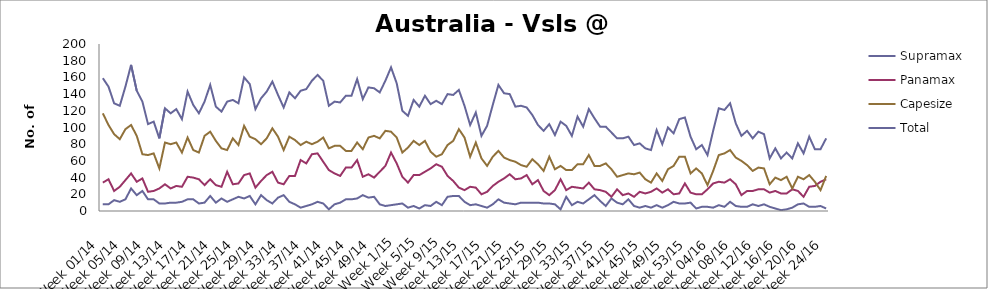
| Category | Supramax | Panamax | Capesize | Total |
|---|---|---|---|---|
| Week 01/14 | 8 | 34 | 117 | 159 |
| Week 02/14 | 8 | 38 | 103 | 149 |
| Week 03/14 | 13 | 24 | 92 | 129 |
| Week 04/14 | 11 | 29 | 86 | 126 |
| Week 05/14 | 14 | 37 | 98 | 149 |
| Week 06/14 | 27 | 45 | 103 | 175 |
| Week 07/14 | 19 | 35 | 90 | 144 |
| Week 08/14 | 24 | 39 | 68 | 131 |
| Week 09/14 | 14 | 23 | 67 | 104 |
| Week 10/14 | 14 | 24 | 69 | 107 |
| Week 11/14 | 9 | 27 | 51 | 87 |
| Week 12/14 | 9 | 32 | 82 | 123 |
| Week 13/14 | 10 | 27 | 80 | 117 |
| Week 14/14 | 10 | 30 | 82 | 122 |
| Week 15/14 | 11 | 29 | 70 | 110 |
| Week 16/14 | 14 | 41 | 88 | 143 |
| Week 17/14 | 14 | 40 | 73 | 127 |
| Week 18/14 | 9 | 38 | 70 | 117 |
| Week 19/14 | 10 | 31 | 90 | 131 |
| Week 20/14 | 18 | 38 | 95 | 151 |
| Week 21/14 | 10 | 31 | 84 | 125 |
| Week 22/14 | 15 | 29 | 75 | 119 |
| Week 23/14 | 11 | 47 | 73 | 131 |
| Week 24/14 | 14 | 32 | 87 | 133 |
| Week 25/14 | 17 | 33 | 79 | 129 |
| Week 26/14 | 15 | 43 | 102 | 160 |
| Week 27/14 | 18 | 45 | 89 | 152 |
| Week 28/14 | 8 | 28 | 86 | 122 |
| Week 29/14 | 19 | 36 | 80 | 135 |
| Week 30/14 | 13 | 43 | 87 | 143 |
| Week 31/14 | 9 | 47 | 99 | 155 |
| Week 32/14 | 16 | 34 | 89 | 139 |
| Week 33/14 | 19 | 32 | 73 | 124 |
| Week 34/14 | 11 | 42 | 89 | 142 |
| Week 35/14 | 8 | 42 | 85 | 135 |
| Week 36/14 | 4 | 61 | 79 | 144 |
| Week 37/14 | 6 | 57 | 83 | 146 |
| Week 38/14 | 8 | 68 | 80 | 156 |
| Week 39/14 | 11 | 69 | 83 | 163 |
| Week 40/14 | 9 | 59 | 88 | 156 |
| Week 41/14 | 2 | 49 | 75 | 126 |
| Week 42/14 | 8 | 45 | 78 | 131 |
| Week 43/14 | 10 | 42 | 78 | 130 |
| Week 44/14 | 14 | 52 | 72 | 138 |
| Week 45/14 | 14 | 52 | 72 | 138 |
| Week 46/14 | 15 | 61 | 82 | 158 |
| Week 47/14 | 19 | 41 | 74 | 134 |
| Week 48/14 | 16 | 44 | 88 | 148 |
| Week 49/14 | 17 | 40 | 90 | 147 |
| Week 50/14 | 8 | 47 | 87 | 142 |
| Week 51/14 | 6 | 54 | 96 | 156 |
| Week 52/14 | 7 | 70 | 95 | 172 |
| Week 1/15 | 8 | 57 | 88 | 153 |
| Week 2/15 | 9 | 41 | 70 | 120 |
| Week 3/15 | 4 | 34 | 76 | 114 |
| Week 4/15 | 6 | 43 | 84 | 133 |
| Week 5/15 | 3 | 43 | 79 | 125 |
| Week 6/15 | 7 | 47 | 84 | 138 |
| Week 7/15 | 6 | 51 | 71 | 128 |
| Week 8/15 | 11 | 56 | 65 | 132 |
| Week 9/15 | 7 | 53 | 68 | 128 |
| Week 10/15 | 17 | 42 | 79 | 140 |
| Week 11/15 | 18 | 36 | 84 | 139 |
| Week 12/15 | 18 | 28 | 98 | 145 |
| Week 13/15 | 11 | 25 | 88 | 126 |
| Week 14/15 | 7 | 29 | 65 | 103 |
| Week 15/15 | 8 | 28 | 82 | 118 |
| Week 16/15 | 6 | 20 | 63 | 90 |
| Week 17/15 | 4 | 23 | 54 | 102 |
| Week 18/15 | 8 | 30 | 65 | 127 |
| Week 19/15 | 14 | 35 | 72 | 151 |
| Week 20/15 | 10 | 39 | 64 | 141 |
| Week 21/15 | 9 | 44 | 61 | 140 |
| Week 22/15 | 8 | 38 | 59 | 125 |
| Week 23/15 | 10 | 39 | 55 | 126 |
| Week 24/15 | 10 | 43 | 53 | 124 |
| Week 25/15 | 10 | 32 | 62 | 115 |
| Week 26/15 | 10 | 37 | 56 | 103 |
| Week 27/15 | 9 | 24 | 48 | 96 |
| Week 28/15 | 9 | 19 | 65 | 104 |
| Week 29/15 | 8 | 25 | 50 | 91 |
| Week 30/15 | 2 | 38 | 54 | 107 |
| Week 31/15 | 17 | 25 | 49 | 102 |
| Week 32/15 | 7 | 29 | 49 | 90 |
| Week 33/15 | 11 | 28 | 56 | 113 |
| Week 34/15 | 9 | 27 | 56 | 101 |
| Week 35/15 | 14 | 34 | 67 | 122 |
| Week 36/15 | 19 | 26 | 54 | 111 |
| Week 37/15 | 12 | 25 | 54 | 101 |
| Week 38/15 | 6 | 23 | 57 | 101 |
| Week 39/15 | 15 | 17 | 50 | 94 |
| Week 40/15 | 10 | 26 | 41 | 87 |
| Week 41/15 | 8 | 19 | 43 | 87 |
| Week 42/15 | 14 | 21 | 45 | 89 |
| Week 43/15 | 6 | 17 | 44 | 79 |
| Week 44/15 | 4 | 23 | 46 | 81 |
| Week 45/15 | 6 | 21 | 38 | 75 |
| Week 46/15 | 4 | 23 | 34 | 73 |
| Week 47/15 | 7 | 27 | 45 | 97 |
| Week 48/15 | 4 | 22 | 36 | 80 |
| Week 49/15 | 7 | 26 | 50 | 100 |
| Week 50/15 | 11 | 20 | 54 | 93 |
| Week 51/15 | 9 | 21 | 65 | 110 |
| Week 52/15 | 9 | 33 | 65 | 112 |
| Week 53/15 | 10 | 22 | 45 | 89 |
| Week 01/16 | 3 | 20 | 51 | 74 |
| Week 02/16 | 5 | 20 | 45 | 79 |
| Week 03/16 | 5 | 26 | 31 | 67 |
| Week 04/16 | 4 | 33 | 48 | 96 |
| Week 05/16 | 7 | 35 | 67 | 123 |
| Week 06/16 | 5 | 34 | 69 | 121 |
| Week 07/16 | 11 | 38 | 73 | 129 |
| Week 08/16 | 6 | 32 | 64 | 105 |
| Week 09/16 | 5 | 19 | 60 | 90 |
| Week 10/16 | 5 | 24 | 55 | 96 |
| Week 11/16 | 8 | 24 | 48 | 87 |
| Week 12/16 | 6 | 26 | 52 | 95 |
| Week 13/16 | 8 | 26 | 51 | 92 |
| Week 14/16 | 5 | 22 | 32 | 63 |
| Week 15/16 | 3 | 24 | 40 | 75 |
| Week 16/16 | 1 | 21 | 37 | 63 |
| Week 17/16 | 2 | 21 | 41 | 70 |
| Week 18/16 | 4 | 26 | 27 | 63 |
| Week 19/16 | 8 | 24 | 41 | 81 |
| Week 20/16 | 9 | 17 | 38 | 69 |
| Week 21/16 | 5 | 29 | 43 | 89 |
| Week 22/16 | 5 | 30 | 35 | 74 |
| Week 23/16 | 6 | 35 | 25 | 74 |
| Week 24/16 | 3 | 38 | 42 | 87 |